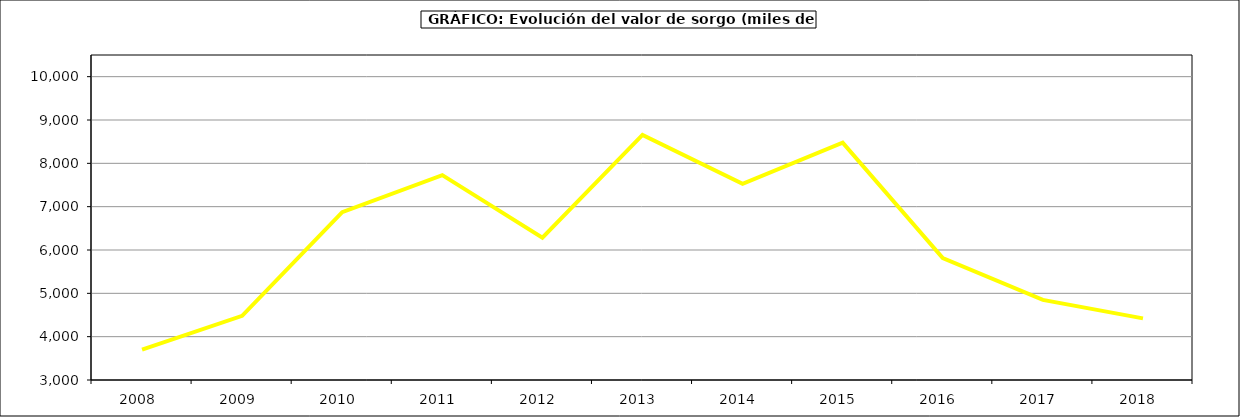
| Category | Producción |
|---|---|
| 2008.0 | 3699.984 |
| 2009.0 | 4481.299 |
| 2010.0 | 6873.468 |
| 2011.0 | 7728.6 |
| 2012.0 | 6283.71 |
| 2013.0 | 8656.32 |
| 2014.0 | 7525 |
| 2015.0 | 8476 |
| 2016.0 | 5814 |
| 2017.0 | 4849.204 |
| 2018.0 | 4421.779 |